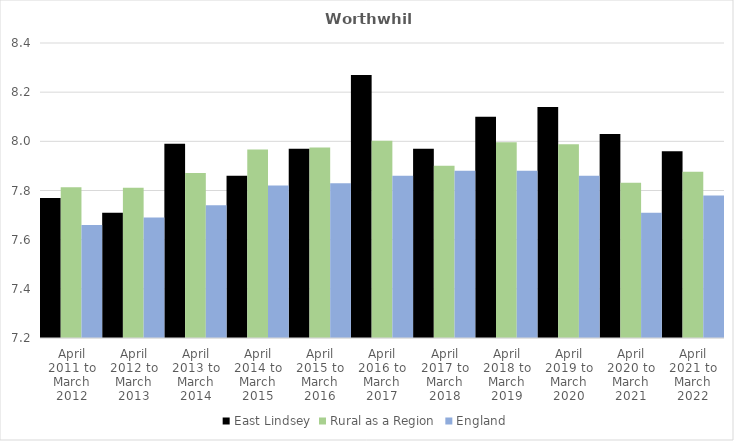
| Category | East Lindsey | Rural as a Region | England |
|---|---|---|---|
| April 2011 to March 2012 | 7.77 | 7.813 | 7.66 |
| April 2012 to March 2013 | 7.71 | 7.811 | 7.69 |
| April 2013 to March 2014 | 7.99 | 7.871 | 7.74 |
| April 2014 to March 2015 | 7.86 | 7.967 | 7.82 |
| April 2015 to March 2016 | 7.97 | 7.975 | 7.83 |
| April 2016 to March 2017 | 8.27 | 8.002 | 7.86 |
| April 2017 to March 2018 | 7.97 | 7.9 | 7.88 |
| April 2018 to March 2019 | 8.1 | 7.996 | 7.88 |
| April 2019 to March 2020 | 8.14 | 7.988 | 7.86 |
| April 2020 to March 2021 | 8.03 | 7.831 | 7.71 |
| April 2021 to March 2022 | 7.96 | 7.877 | 7.78 |